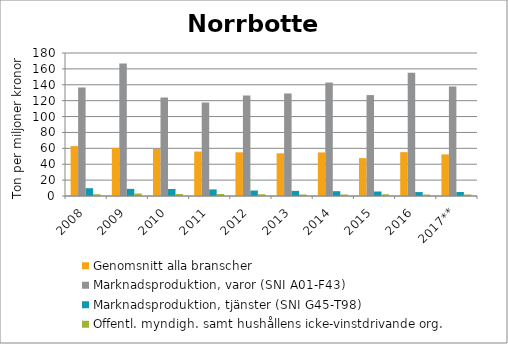
| Category | Genomsnitt alla branscher | Marknadsproduktion, varor (SNI A01-F43) | Marknadsproduktion, tjänster (SNI G45-T98) | Offentl. myndigh. samt hushållens icke-vinstdrivande org. |
|---|---|---|---|---|
| 2008 | 62.823 | 136.586 | 9.815 | 2.253 |
| 2009 | 60.575 | 166.694 | 8.976 | 3.138 |
| 2010 | 59.365 | 123.971 | 8.834 | 2.488 |
| 2011 | 55.949 | 117.848 | 8.292 | 2.53 |
| 2012 | 55.032 | 126.529 | 6.886 | 2.185 |
| 2013 | 53.72 | 129.059 | 6.452 | 1.961 |
| 2014 | 54.882 | 142.782 | 6.057 | 1.963 |
| 2015 | 47.661 | 127.03 | 5.67 | 2.173 |
| 2016 | 55.229 | 155.147 | 4.963 | 1.855 |
| 2017** | 52.376 | 137.729 | 5.019 | 1.898 |